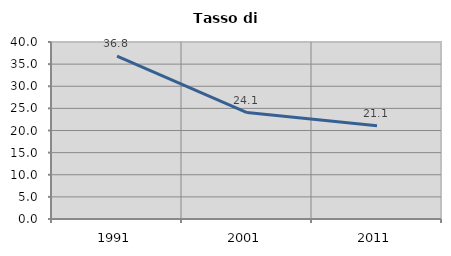
| Category | Tasso di disoccupazione   |
|---|---|
| 1991.0 | 36.825 |
| 2001.0 | 24.065 |
| 2011.0 | 21.054 |